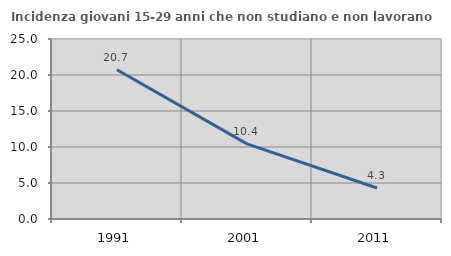
| Category | Incidenza giovani 15-29 anni che non studiano e non lavorano  |
|---|---|
| 1991.0 | 20.727 |
| 2001.0 | 10.435 |
| 2011.0 | 4.301 |